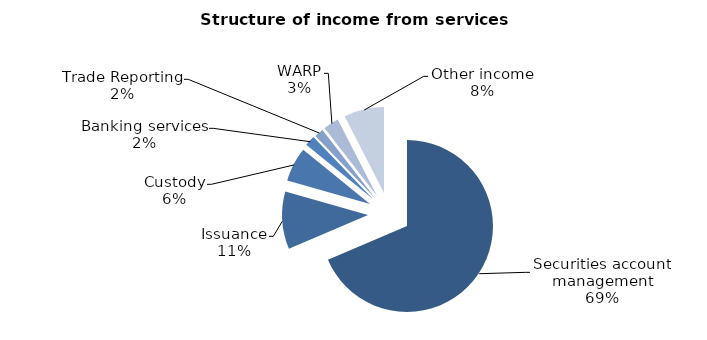
| Category | Series 0 |
|---|---|
| Securities account management | 3331.4 |
| Issuance | 526.4 |
| Custody | 313.6 |
| Banking services | 95.1 |
| Trade Reporting | 84.2 |
| WARP | 141.4 |
| Other income | 366.5 |